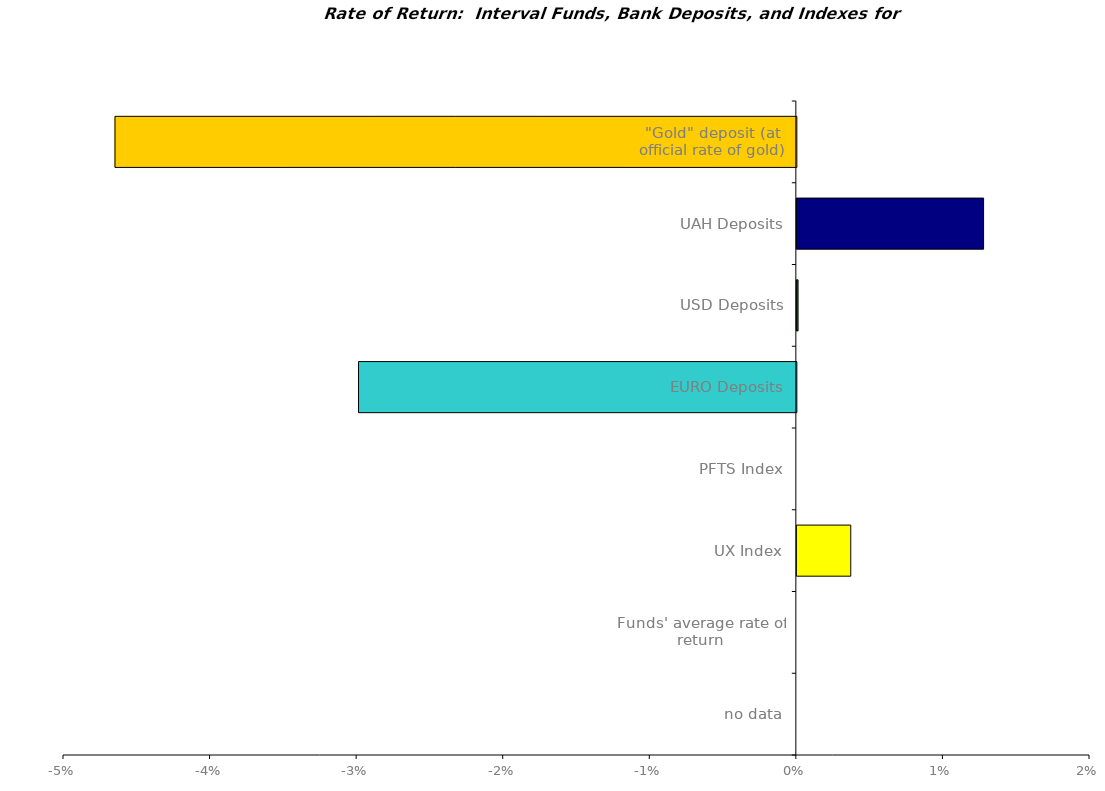
| Category | Series 0 |
|---|---|
| no data | 0 |
| Funds' average rate of return | 0 |
| UX Index | 0.004 |
| PFTS Index | 0 |
| EURO Deposits | -0.03 |
| USD Deposits | 0 |
| UAH Deposits | 0.013 |
| "Gold" deposit (at official rate of gold) | -0.046 |